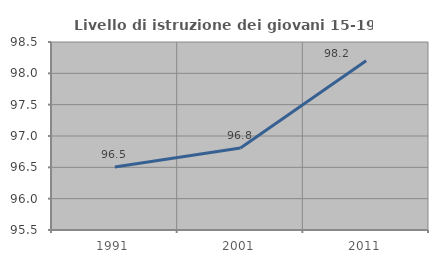
| Category | Livello di istruzione dei giovani 15-19 anni |
|---|---|
| 1991.0 | 96.507 |
| 2001.0 | 96.809 |
| 2011.0 | 98.201 |